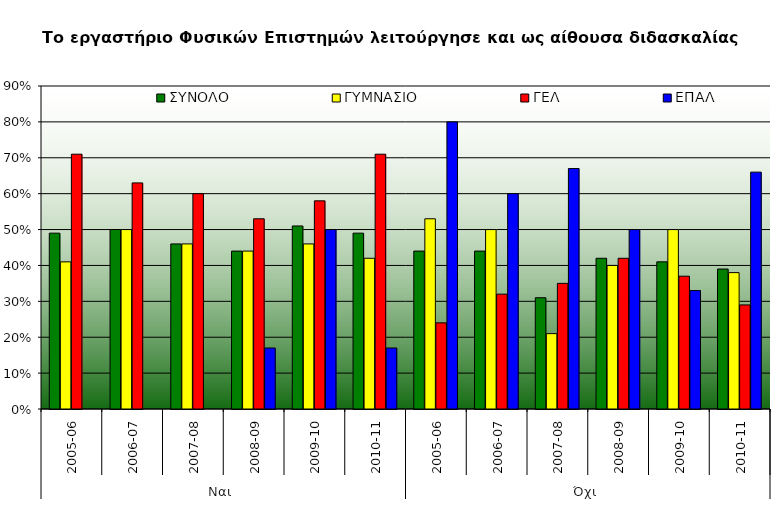
| Category | ΣΥΝΟΛΟ | ΓΥΜΝΑΣΙΟ | ΓΕΛ | ΕΠΑΛ |
|---|---|---|---|---|
| 0 | 0.49 | 0.41 | 0.71 | 0 |
| 1 | 0.5 | 0.5 | 0.63 | 0 |
| 2 | 0.46 | 0.46 | 0.6 | 0 |
| 3 | 0.44 | 0.44 | 0.53 | 0.17 |
| 4 | 0.51 | 0.46 | 0.58 | 0.5 |
| 5 | 0.49 | 0.42 | 0.71 | 0.17 |
| 6 | 0.44 | 0.53 | 0.24 | 0.8 |
| 7 | 0.44 | 0.5 | 0.32 | 0.6 |
| 8 | 0.31 | 0.21 | 0.35 | 0.67 |
| 9 | 0.42 | 0.4 | 0.42 | 0.5 |
| 10 | 0.41 | 0.5 | 0.37 | 0.33 |
| 11 | 0.39 | 0.38 | 0.29 | 0.66 |